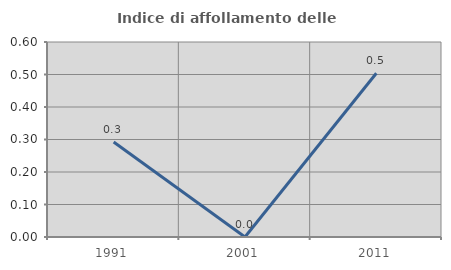
| Category | Indice di affollamento delle abitazioni  |
|---|---|
| 1991.0 | 0.292 |
| 2001.0 | 0 |
| 2011.0 | 0.504 |